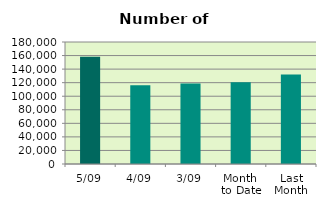
| Category | Series 0 |
|---|---|
| 5/09 | 158400 |
| 4/09 | 116168 |
| 3/09 | 118722 |
| Month 
to Date | 120463.5 |
| Last
Month | 132110.818 |